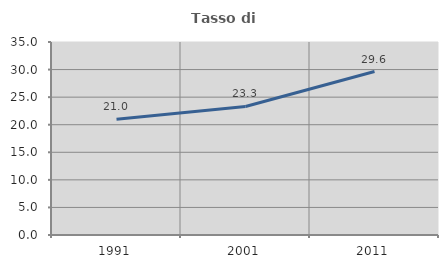
| Category | Tasso di occupazione   |
|---|---|
| 1991.0 | 20.972 |
| 2001.0 | 23.307 |
| 2011.0 | 29.645 |